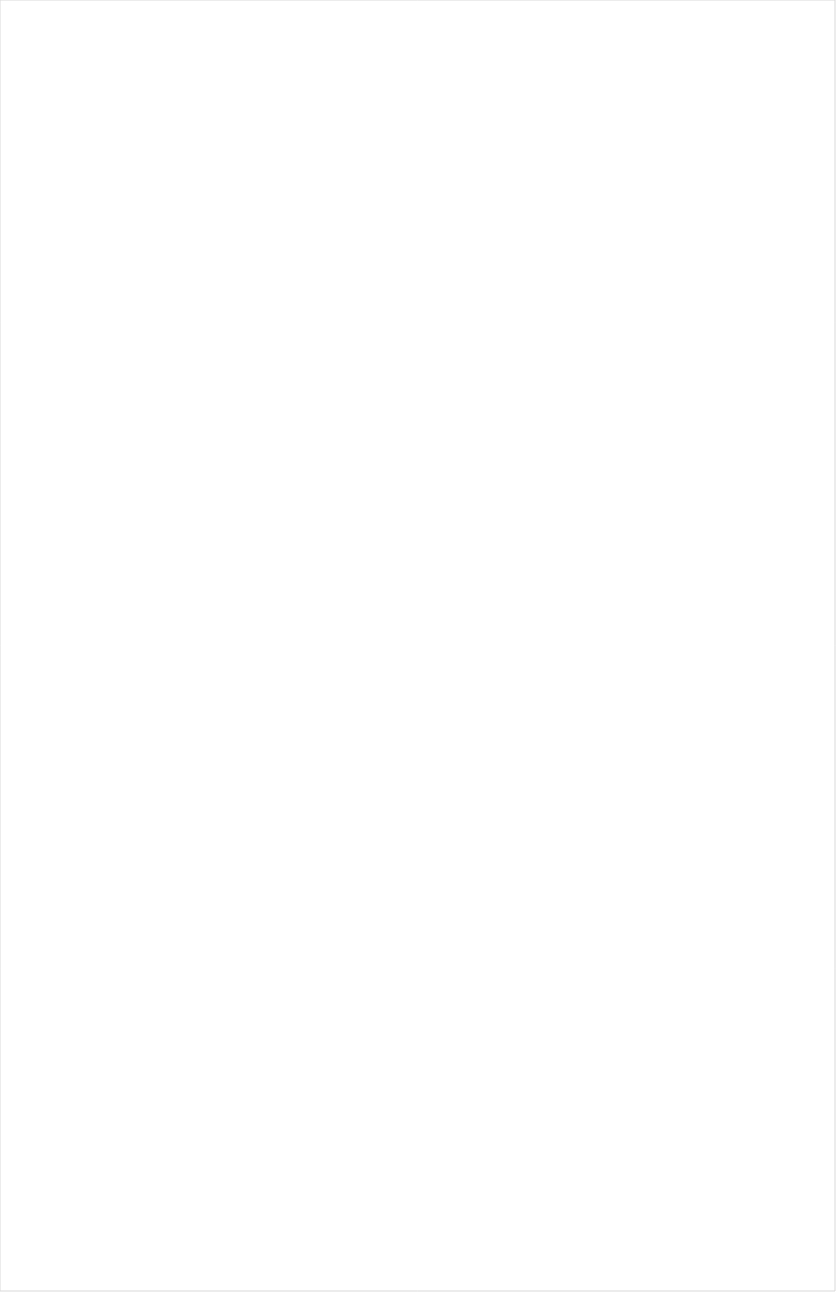
| Category | Total |
|---|---|
| Teen Nick | -0.246 |
| Nick Toons | -0.221 |
| Nick Jr. | -0.211 |
| Cartoon Network | -0.2 |
| Nick | -0.191 |
| Disney Junior US | -0.19 |
| Disney Channel | -0.184 |
| TUDN | -0.181 |
| VH1 | -0.177 |
| BET Her | -0.176 |
| UniMas | -0.175 |
| Disney XD | -0.166 |
| Telemundo | -0.16 |
| Nick@Nite | -0.158 |
| Adult Swim | -0.158 |
| Galavision | -0.148 |
| truTV | -0.144 |
| Universal Kids | -0.142 |
| ESPN Deportes | -0.135 |
| BET | -0.129 |
| MTV | -0.126 |
| Comedy Central | -0.123 |
| FXX | -0.118 |
| TV ONE | -0.113 |
| NBA TV | -0.112 |
| Univision | -0.106 |
| ESPN2 | -0.102 |
| E! | -0.089 |
| ESPN | -0.088 |
| ESPNEWS | -0.087 |
| TNT | -0.085 |
| NFL Network | -0.081 |
| MTV2 | -0.08 |
| FX | -0.079 |
| Viceland | -0.079 |
| Freeform | -0.078 |
| NBC Universo | -0.078 |
| BRAVO | -0.077 |
| FXDEP | -0.076 |
| TBS | -0.067 |
| SYFY | -0.066 |
| USA Network | -0.054 |
| Discovery Life Channel | -0.051 |
| Discovery Family Channel | -0.048 |
| Paramount Network | -0.048 |
| NHL | -0.041 |
| Lifetime | -0.04 |
| MyNetworkTV | -0.039 |
| Lifetime Movies | -0.037 |
| ESPNU | -0.036 |
| Independent Film (IFC) | -0.034 |
| CBS Sports | -0.032 |
| Olympic Channel | -0.032 |
| TLC | -0.024 |
| OXYGEN | -0.022 |
| AMC | -0.022 |
| Cooking Channel | -0.022 |
| A&E | -0.018 |
| WE TV | -0.016 |
| Food Network | -0.013 |
| CMTV | -0.013 |
| FX Movie Channel | -0.012 |
| BBC America | -0.01 |
| Travel | -0.008 |
| Destination America | -0.008 |
| Discovery Channel | -0.004 |
| CNBC | -0.001 |
| FOX | 0 |
| Fox Sports 1 | 0.001 |
| Oprah Winfrey Network | 0.001 |
| Ovation | 0.002 |
| MLB Network | 0.007 |
| The Sportsman Channel | 0.008 |
| Investigation Discovery | 0.012 |
| PAC-12 Network | 0.016 |
| Big Ten Network | 0.019 |
| Headline News | 0.029 |
| Motor Trend Network | 0.03 |
| POP | 0.034 |
| FYI | 0.034 |
| CW | 0.035 |
| Reelz Channel | 0.037 |
| Game Show | 0.042 |
| ABC | 0.043 |
| Animal Planet | 0.048 |
| Logo | 0.049 |
| National Geographic | 0.051 |
| ION | 0.056 |
| DIY | 0.056 |
| HGTV | 0.057 |
| History Channel | 0.057 |
| TV LAND | 0.059 |
| NBC | 0.064 |
| CNN | 0.064 |
| UP TV | 0.07 |
| NBC Sports | 0.074 |
| WGN America | 0.078 |
| American Heroes Channel | 0.083 |
| Science Channel | 0.089 |
| Golf | 0.09 |
| Great American Country | 0.1 |
| National Geographic Wild | 0.104 |
| Outdoor Channel | 0.107 |
| CBS | 0.115 |
| SundanceTV | 0.117 |
| Bloomberg HD | 0.118 |
| Weather Channel | 0.131 |
| Fox News | 0.139 |
| Hallmark | 0.152 |
| Smithsonian | 0.158 |
| Tennis Channel | 0.168 |
| MSNBC | 0.174 |
| Fox Business | 0.221 |
| Hallmark Movies & Mysteries | 0.242 |
| INSP | 0.246 |
| PBS | 0.26 |
| RFD TV | 0.265 |